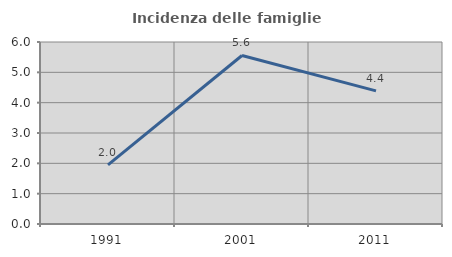
| Category | Incidenza delle famiglie numerose |
|---|---|
| 1991.0 | 1.951 |
| 2001.0 | 5.556 |
| 2011.0 | 4.39 |